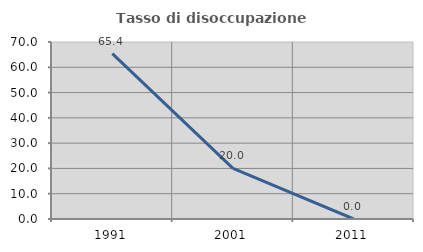
| Category | Tasso di disoccupazione giovanile  |
|---|---|
| 1991.0 | 65.385 |
| 2001.0 | 20 |
| 2011.0 | 0 |